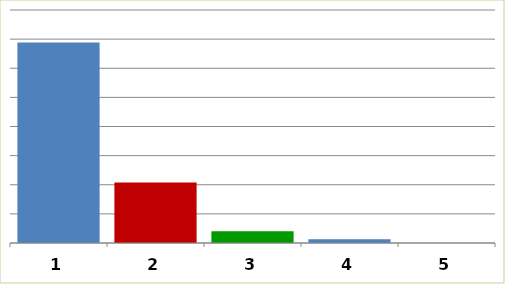
| Category | Series 0 |
|---|---|
| 0 | 137710238.192 |
| 1 | 41606825 |
| 2 | 8112097 |
| 3 | 2598540 |
| 4 | 0 |